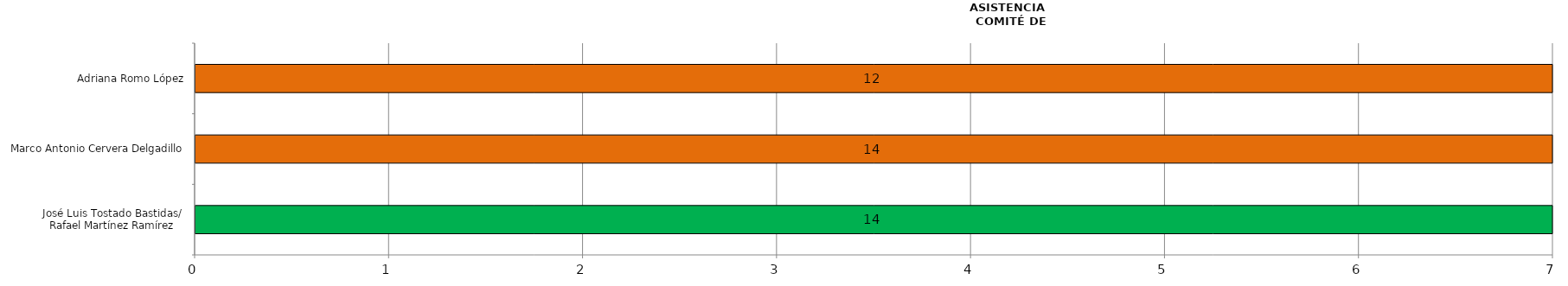
| Category | Series 0 |
|---|---|
| José Luis Tostado Bastidas/
Rafael Martínez Ramírez | 14 |
| Marco Antonio Cervera Delgadillo | 14 |
| Adriana Romo López | 12 |